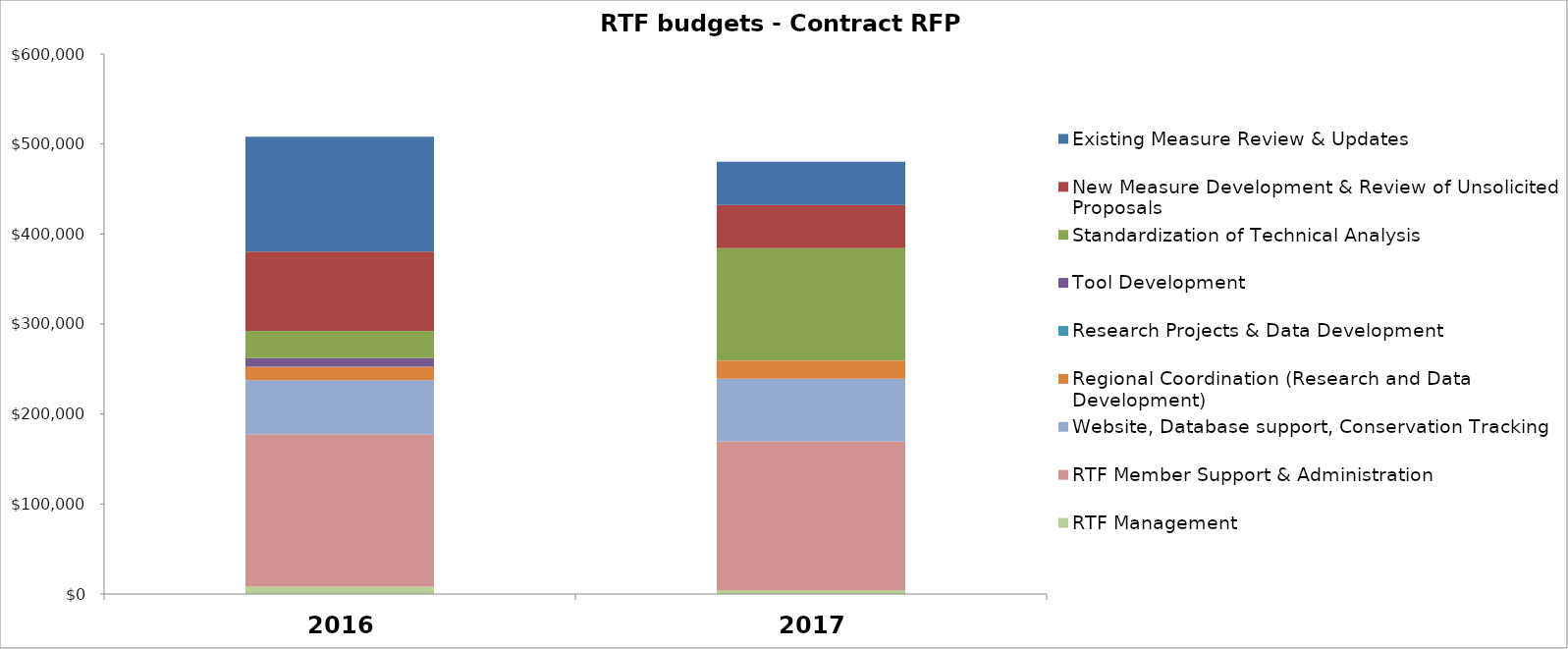
| Category | RTF Management | RTF Member Support & Administration | Website, Database support, Conservation Tracking  | Regional Coordination (Research and Data Development) | Research Projects & Data Development | Tool Development | Standardization of Technical Analysis | New Measure Development & Review of Unsolicited Proposals | Existing Measure Review & Updates |
|---|---|---|---|---|---|---|---|---|---|
| 0 | 8300 | 169200 | 60000 | 15000 | 0 | 10000 | 30000 | 88000 | 127500 |
| 1 | 4300 | 165000 | 70000 | 20000 | 0 | 0 | 125000 | 48000 | 48000 |